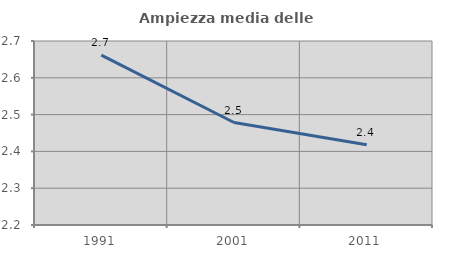
| Category | Ampiezza media delle famiglie |
|---|---|
| 1991.0 | 2.662 |
| 2001.0 | 2.478 |
| 2011.0 | 2.418 |